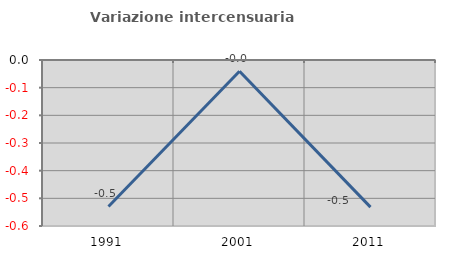
| Category | Variazione intercensuaria annua |
|---|---|
| 1991.0 | -0.529 |
| 2001.0 | -0.041 |
| 2011.0 | -0.532 |